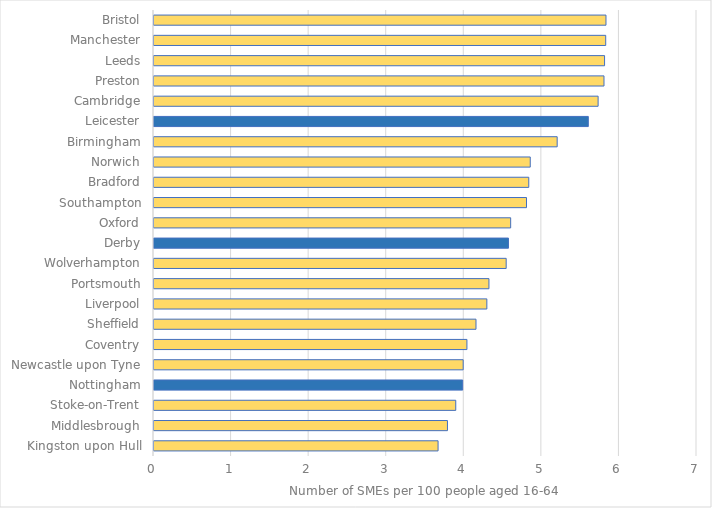
| Category | Series 0 |
|---|---|
| Kingston upon Hull | 3.662 |
| Middlesbrough | 3.783 |
| Stoke-on-Trent | 3.89 |
| Nottingham | 3.979 |
| Newcastle upon Tyne | 3.986 |
| Coventry | 4.034 |
| Sheffield | 4.151 |
| Liverpool | 4.291 |
| Portsmouth | 4.318 |
| Wolverhampton | 4.54 |
| Derby | 4.569 |
| Oxford | 4.598 |
| Southampton | 4.802 |
| Bradford | 4.831 |
| Norwich | 4.85 |
| Birmingham | 5.197 |
| Leicester | 5.599 |
| Cambridge | 5.725 |
| Preston | 5.801 |
| Leeds | 5.809 |
| Manchester | 5.823 |
| Bristol | 5.827 |